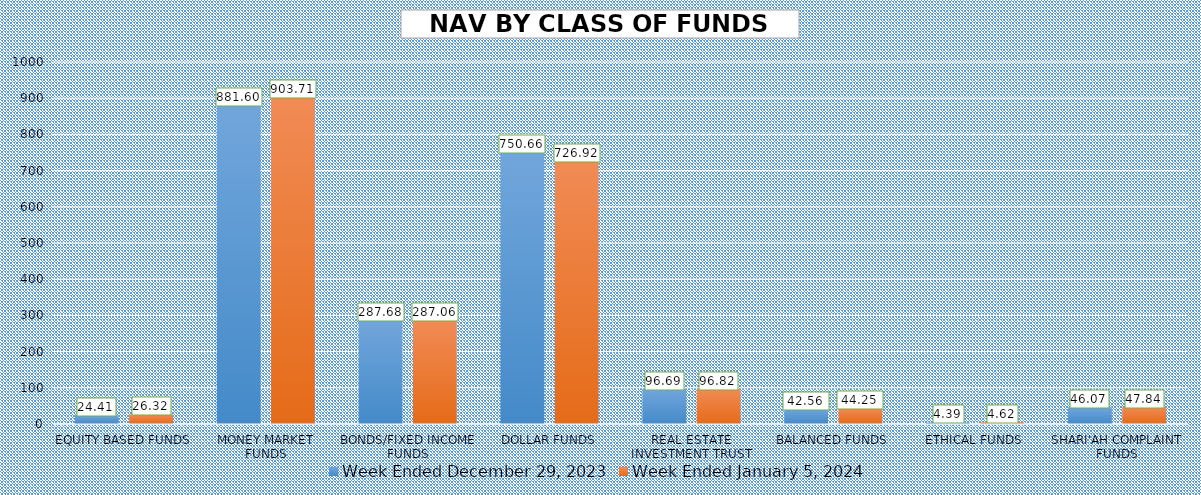
| Category | Week Ended December 29, 2023 | Week Ended January 5, 2024 |
|---|---|---|
| EQUITY BASED FUNDS | 24.405 | 26.318 |
| MONEY MARKET FUNDS | 881.603 | 903.708 |
| BONDS/FIXED INCOME FUNDS | 287.675 | 287.055 |
| DOLLAR FUNDS | 750.658 | 726.921 |
| REAL ESTATE INVESTMENT TRUST | 96.686 | 96.816 |
| BALANCED FUNDS | 42.556 | 44.249 |
| ETHICAL FUNDS | 4.392 | 4.62 |
| SHARI'AH COMPLAINT FUNDS | 46.069 | 47.838 |